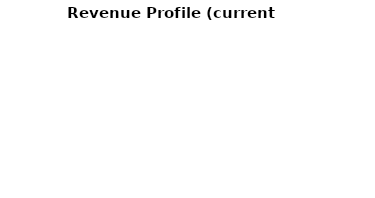
| Category | Current year |
|---|---|
| Vendor Fees | 0 |
| Fundraising | 0 |
| Other | 0 |